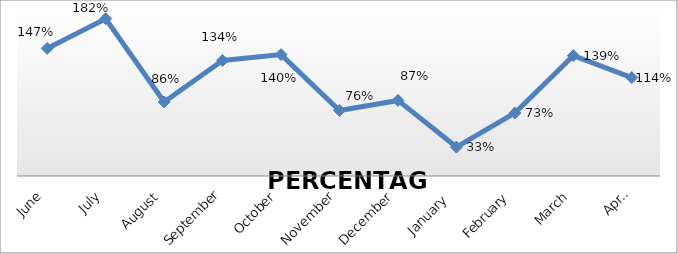
| Category | PERCENTAGE |
|---|---|
| June | 1.475 |
| July | 1.818 |
| August | 0.855 |
| September | 1.336 |
| October | 1.404 |
| November | 0.758 |
| December | 0.874 |
| January  | 0.334 |
| February | 0.728 |
| March | 1.392 |
| April | 1.138 |